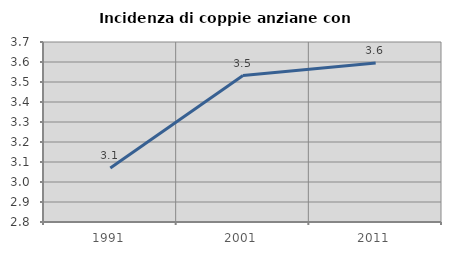
| Category | Incidenza di coppie anziane con figli |
|---|---|
| 1991.0 | 3.07 |
| 2001.0 | 3.532 |
| 2011.0 | 3.596 |